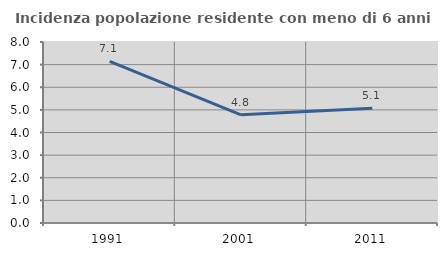
| Category | Incidenza popolazione residente con meno di 6 anni |
|---|---|
| 1991.0 | 7.141 |
| 2001.0 | 4.781 |
| 2011.0 | 5.067 |